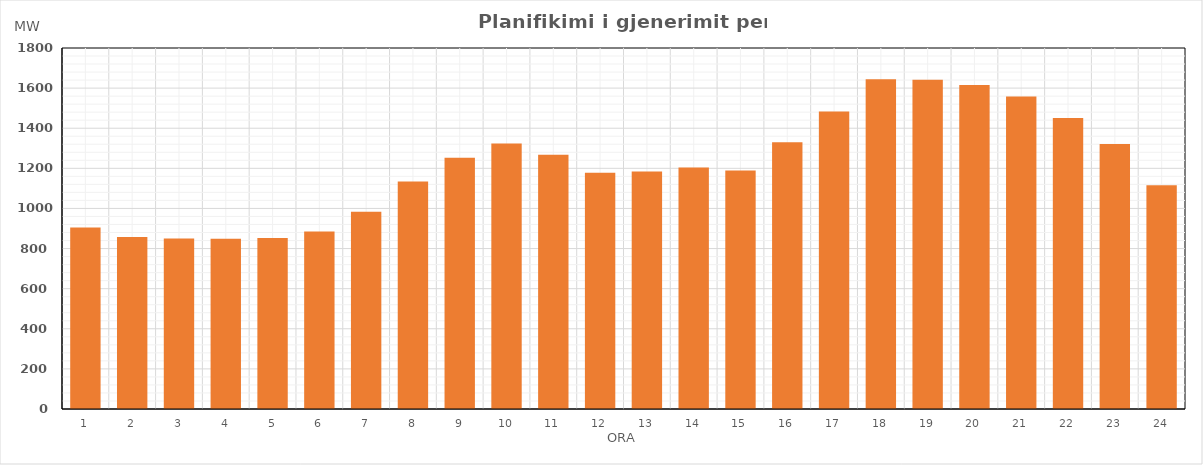
| Category | Max (MW) |
|---|---|
| 0 | 905.02 |
| 1 | 857.42 |
| 2 | 850.33 |
| 3 | 848.33 |
| 4 | 852.01 |
| 5 | 885.42 |
| 6 | 984.13 |
| 7 | 1134.86 |
| 8 | 1252.86 |
| 9 | 1323.48 |
| 10 | 1267.25 |
| 11 | 1177.81 |
| 12 | 1184.37 |
| 13 | 1204.4 |
| 14 | 1189.2 |
| 15 | 1330.63 |
| 16 | 1483.14 |
| 17 | 1644.13 |
| 18 | 1641.34 |
| 19 | 1615.46 |
| 20 | 1558.46 |
| 21 | 1450.55 |
| 22 | 1321.59 |
| 23 | 1115.71 |